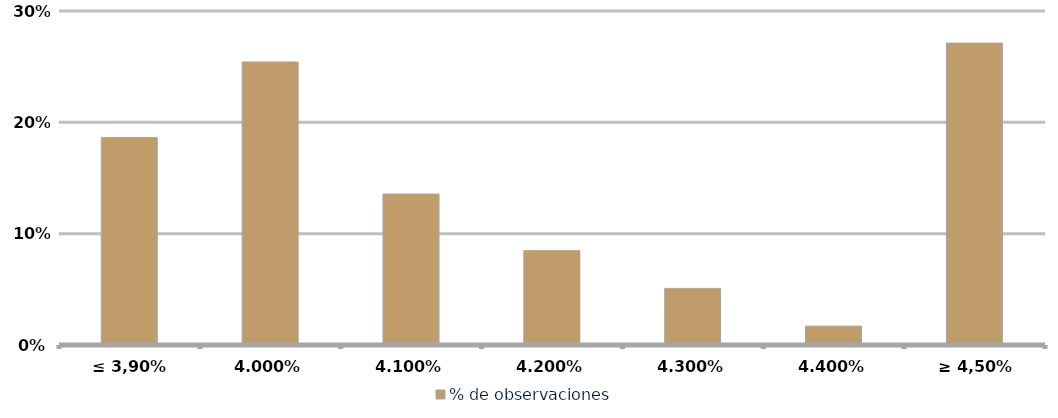
| Category | % de observaciones  |
|---|---|
| ≤ 3,90% | 0.186 |
| 4,00% | 0.254 |
| 4,10% | 0.136 |
| 4,20% | 0.085 |
| 4,30% | 0.051 |
| 4,40% | 0.017 |
| ≥ 4,50% | 0.271 |